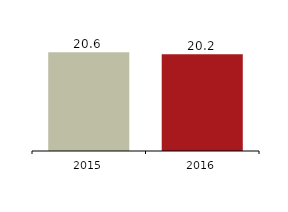
| Category | Profit for the year |
|---|---|
| 2016.0 | 20158 |
| 2015.0 | 20578 |